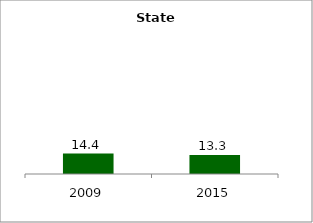
| Category | State |
|---|---|
| 2009.0 | 14.414 |
| 2015.0 | 13.311 |